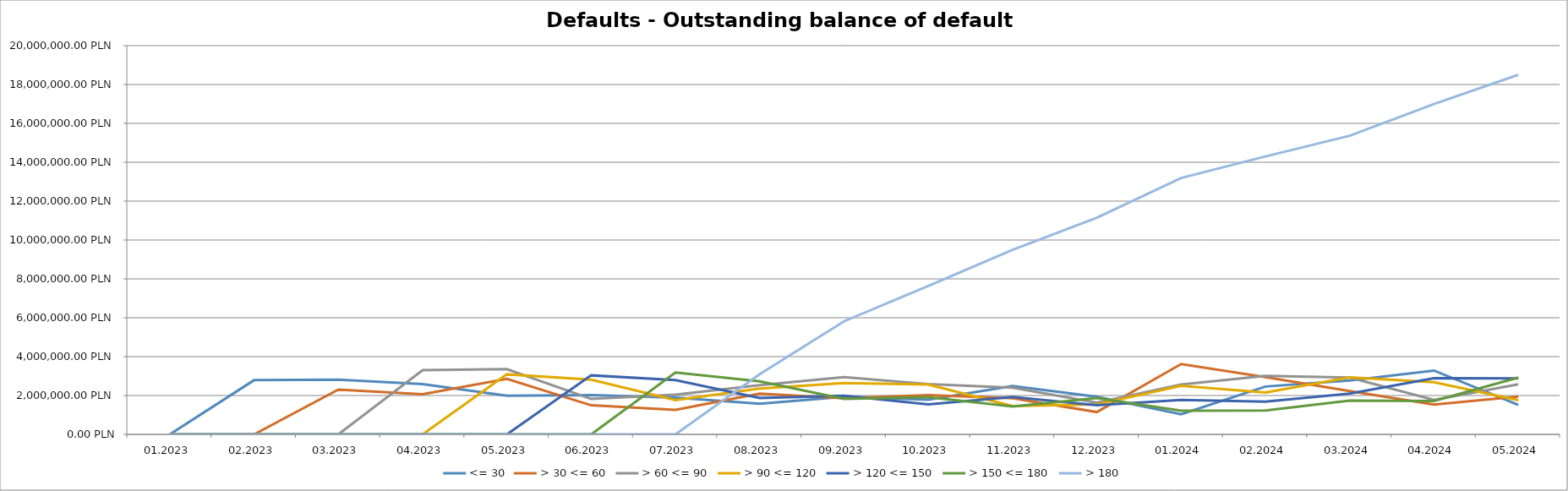
| Category | <= 30 | > 30 <= 60 | > 60 <= 90 | > 90 <= 120 | > 120 <= 150 | > 150 <= 180 | > 180 |
|---|---|---|---|---|---|---|---|
| 01.2023 | 0 | 0 | 0 | 0 | 0 | 0 | 0 |
| 02.2023 | 2788519.82 | 0 | 0 | 0 | 0 | 0 | 0 |
| 03.2023 | 2811517.14 | 2305154.07 | 0 | 0 | 0 | 0 | 0 |
| 04.2023 | 2584791.3 | 2064675.87 | 3301101.31 | 0 | 0 | 0 | 0 |
| 05.2023 | 1985441.56 | 2858398.5 | 3353485.78 | 3091988.77 | 0 | 0 | 0 |
| 06.2023 | 2016845.02 | 1496657.8 | 1822162.63 | 2812422.86 | 3037767.68 | 0 | 0 |
| 07.2023 | 1886118.05 | 1257979.4 | 2047168.21 | 1762916.26 | 2793763.11 | 3184053.47 | 0 |
| 08.2023 | 1572650.17 | 2099798.77 | 2534461.69 | 2357426.74 | 1871124.51 | 2723545.23 | 3093972.9 |
| 09.2023 | 1936023.84 | 1858916.55 | 2940706.37 | 2644290.89 | 1991761.95 | 1826544.8 | 5816448.05 |
| 10.2023 | 1787856.09 | 2019010.42 | 2585069.36 | 2560620.78 | 1548143.78 | 1909160.81 | 7632122.35 |
| 11.2023 | 2487439.47 | 1854213.59 | 2398255.83 | 1460739.8 | 1923073.63 | 1431220.99 | 9496137.88 |
| 12.2023 | 1933713.74 | 1149222.92 | 1628673.09 | 1540023.57 | 1499486.96 | 1871239.58 | 11143858.33 |
| 01.2024 | 1036575.14 | 3616872.94 | 2560909.55 | 2500120.14 | 1769512.28 | 1214846.09 | 13190834.36 |
| 02.2024 | 2461927.54 | 2941651.28 | 3011992.92 | 2150507.7 | 1685298.78 | 1226154.1 | 14300020.03 |
| 03.2024 | 2767540.03 | 2228274.58 | 2922626.54 | 2934675.45 | 2096645.26 | 1743790.31 | 15362743.97 |
| 04.2024 | 3286345.38 | 1533958.51 | 1773160.19 | 2688284.31 | 2886597.98 | 1722153.11 | 16995434.91 |
| 05.2024 | 1519767.64 | 1946761.78 | 2579245.53 | 1763751.84 | 2876393.07 | 2925045.96 | 18498492.76 |